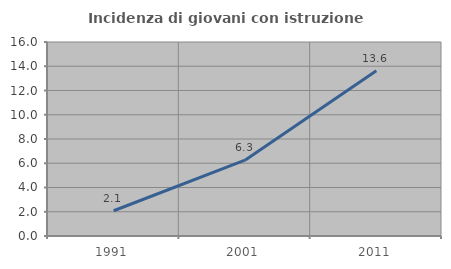
| Category | Incidenza di giovani con istruzione universitaria |
|---|---|
| 1991.0 | 2.083 |
| 2001.0 | 6.25 |
| 2011.0 | 13.636 |